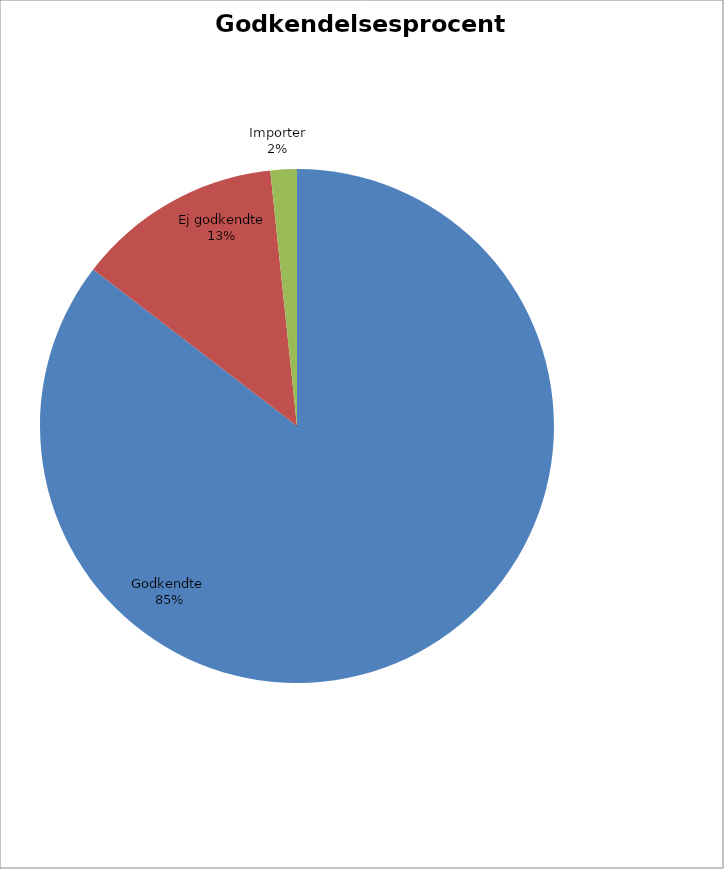
| Category | Series 0 |
|---|---|
| Godkendte  | 85.42 |
| Ej godkendte | 12.92 |
| Importer | 1.66 |